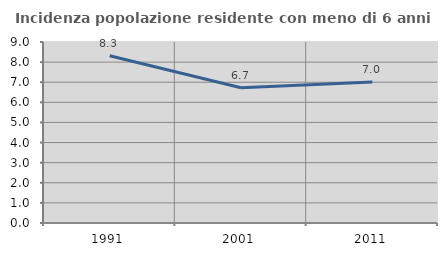
| Category | Incidenza popolazione residente con meno di 6 anni |
|---|---|
| 1991.0 | 8.317 |
| 2001.0 | 6.725 |
| 2011.0 | 7.012 |